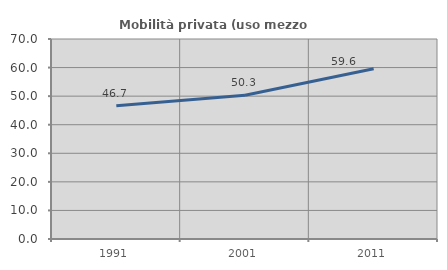
| Category | Mobilità privata (uso mezzo privato) |
|---|---|
| 1991.0 | 46.651 |
| 2001.0 | 50.339 |
| 2011.0 | 59.579 |